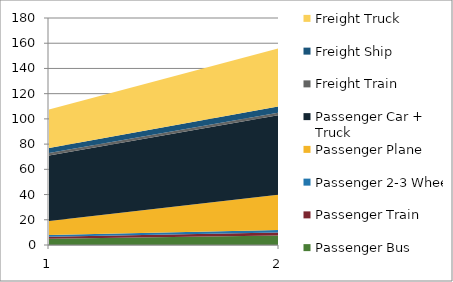
| Category | Passenger Bus | Passenger Train | Passenger 2-3 Wheel | Passenger Plane | Passenger Car + Truck | Freight Train | Freight Ship | Freight Truck |
|---|---|---|---|---|---|---|---|---|
| 0 | 5 | 1.5 | 1.5 | 11 | 52 | 2 | 4 | 30.5 |
| 1 | 7.5 | 2.5 | 2 | 28 | 63 | 2 | 5 | 46 |